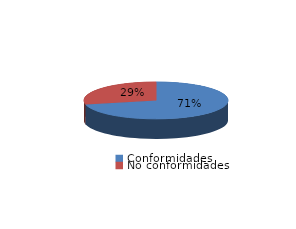
| Category | Series 0 |
|---|---|
| Conformidades | 9553 |
| No conformidades | 3811 |